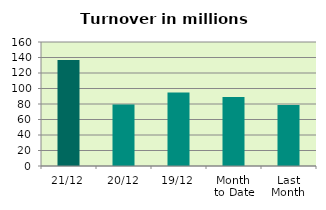
| Category | Series 0 |
|---|---|
| 21/12 | 136.796 |
| 20/12 | 79.354 |
| 19/12 | 94.942 |
| Month 
to Date | 89.079 |
| Last
Month | 78.658 |